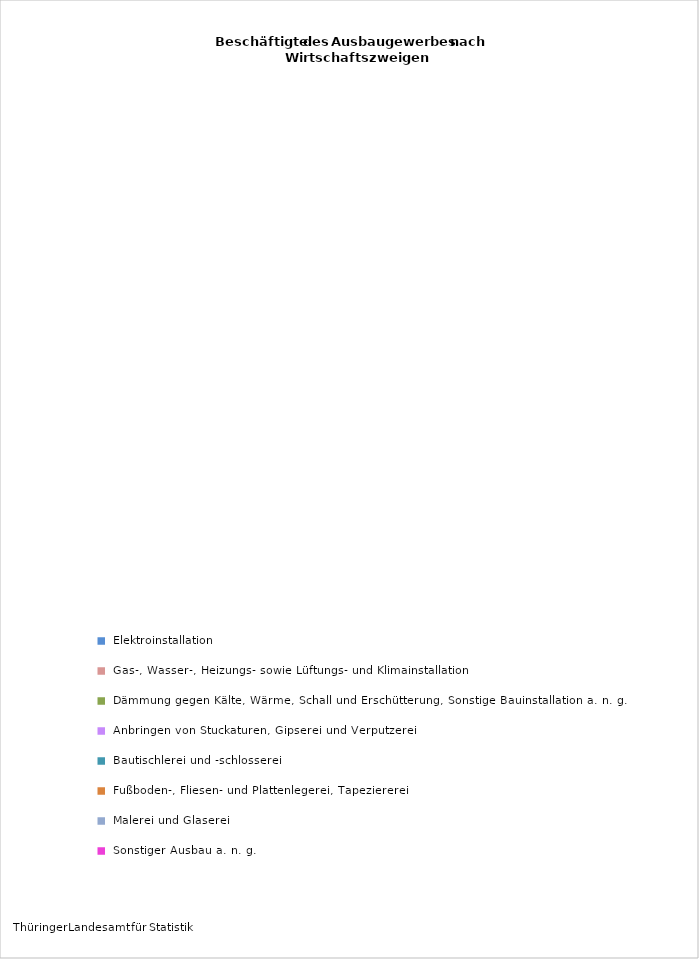
| Category | Anzahl Beschäftigte 2021 |
|---|---|
| Elektroinstallation | 5871 |
| Gas-, Wasser-, Heizungs- sowie Lüftungs- und Klimainstallation | 4458 |
| Dämmung gegen Kälte, Wärme, Schall und Erschütterung, Sonstige Bauinstallation a. n. g. | 903 |
| Anbringen von Stuckaturen, Gipserei und Verputzerei | 275 |
| Bautischlerei und -schlosserei | 953 |
| Fußboden-, Fliesen- und Plattenlegerei, Tapeziererei | 920 |
| Malerei und Glaserei | 1874 |
| Sonstiger Ausbau a. n. g. | 277 |